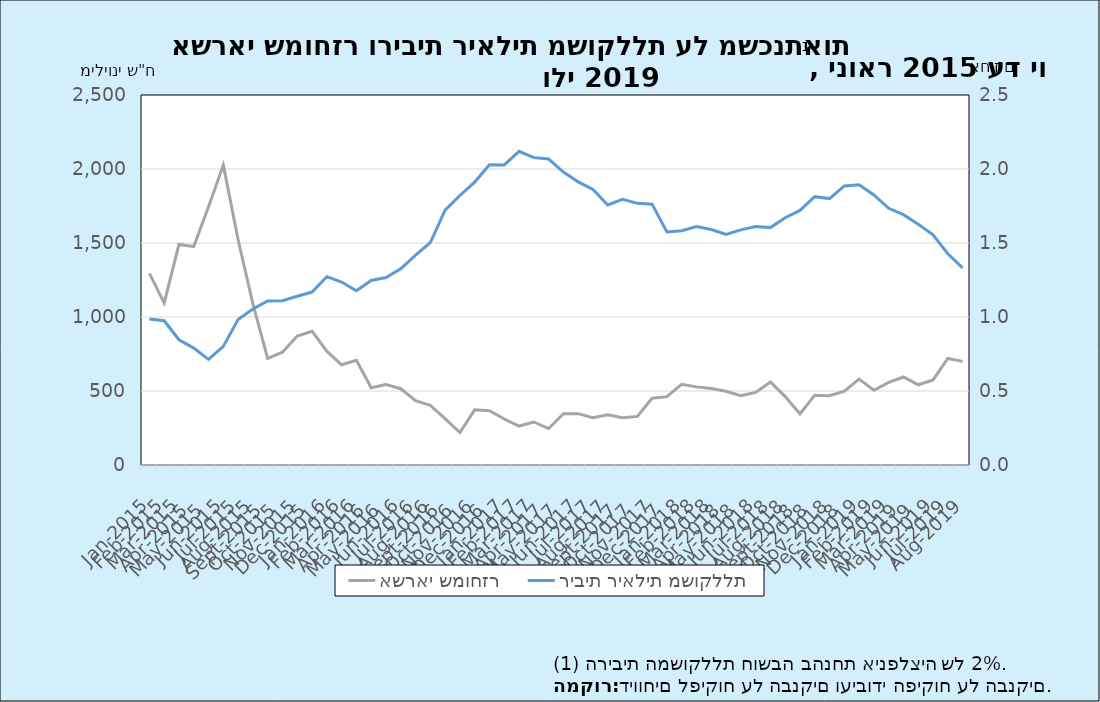
| Category | אשראי שמוחזר |
|---|---|
| 2015-01-31 | 1294.288 |
| 2015-02-28 | 1095.458 |
| 2015-03-31 | 1489.736 |
| 2015-04-30 | 1476.343 |
| 2015-05-31 | 1744.548 |
| 2015-06-30 | 2026.359 |
| 2015-07-31 | 1521.595 |
| 2015-08-31 | 1088.511 |
| 2015-09-30 | 719.825 |
| 2015-10-31 | 762.325 |
| 2015-11-30 | 871.04 |
| 2015-12-31 | 903.919 |
| 2016-01-31 | 768.756 |
| 2016-02-29 | 677.16 |
| 2016-03-31 | 707.631 |
| 2016-04-30 | 522.175 |
| 2016-05-31 | 542.954 |
| 2016-06-30 | 515.396 |
| 2016-07-31 | 435.432 |
| 2016-08-31 | 402.753 |
| 2016-09-30 | 313.538 |
| 2016-10-31 | 219.625 |
| 2016-11-30 | 372.837 |
| 2016-12-31 | 366.645 |
| 2017-01-31 | 310.615 |
| 2017-02-28 | 263.134 |
| 2017-03-31 | 290.674 |
| 2017-04-30 | 246.535 |
| 2017-05-31 | 346.347 |
| 2017-06-30 | 347.007 |
| 2017-07-31 | 320.012 |
| 2017-08-31 | 338.638 |
| 2017-09-30 | 320.076 |
| 2017-10-31 | 328.516 |
| 2017-11-30 | 451.162 |
| 2017-12-31 | 461.989 |
| 2018-01-31 | 544.837 |
| 2018-02-28 | 527.902 |
| 2018-03-31 | 516.891 |
| 2018-04-30 | 498.349 |
| 2018-05-31 | 467.712 |
| 2018-06-30 | 490.49 |
| 2018-07-31 | 561.175 |
| 2018-08-31 | 461.894 |
| 2018-09-30 | 345.788 |
| 2018-10-31 | 471.795 |
| 2018-11-30 | 467.635 |
| 2018-12-31 | 499.282 |
| 2019-01-31 | 580.553 |
| 2019-02-28 | 505.131 |
| 2019-03-31 | 558.471 |
| 2019-04-30 | 594.548 |
| 2019-05-31 | 541.937 |
| 2019-06-30 | 575.227 |
| 2019-07-31 | 720.013 |
| 2019-08-31 | 700.171 |